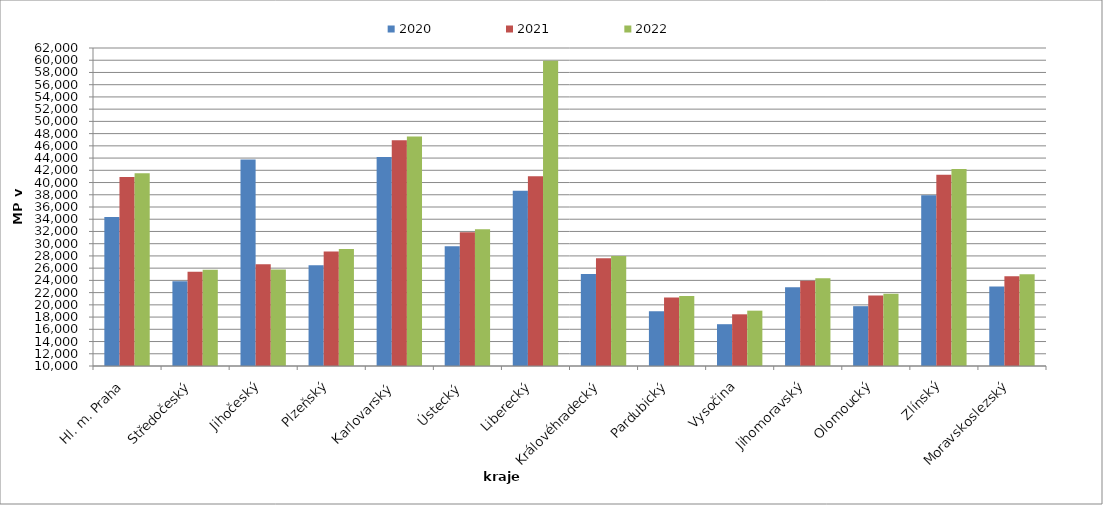
| Category | 2020 | 2021 | 2022 |
|---|---|---|---|
| Hl. m. Praha | 34345.561 | 40918.588 | 41502.752 |
| Středočeský | 23857.488 | 25418.279 | 25750.851 |
| Jihočeský | 43760.668 | 26620.757 | 25759.892 |
| Plzeňský | 26457.568 | 28724.226 | 29139.553 |
| Karlovarský  | 44180 | 46899.512 | 47518.049 |
| Ústecký   | 29569.799 | 31864.715 | 32355.264 |
| Liberecký | 38661.406 | 41032.298 | 59918.821 |
| Královéhradecký | 25049.7 | 27618.599 | 27979.81 |
| Pardubický | 18957.626 | 21199.226 | 21448.908 |
| Vysočina | 16836.188 | 18451.524 | 19047.621 |
| Jihomoravský | 22859.79 | 23943.6 | 24339.317 |
| Olomoucký | 19783.33 | 21515.222 | 21815.037 |
| Zlínský | 37934.812 | 41269.428 | 42218.284 |
| Moravskoslezský | 22987.799 | 24677.12 | 25007.129 |